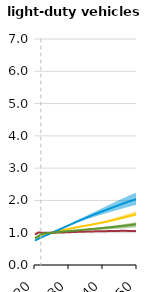
| Category | Reference |
|---|---|
| 2020.0 | 0.83 |
| 2021.0 | 0.895 |
| 2022.0 | 0.963 |
| 2023.0 | 0.982 |
| 2024.0 | 0.992 |
| 2025.0 | 1 |
| 2026.0 | 1.01 |
| 2027.0 | 1.022 |
| 2028.0 | 1.034 |
| 2029.0 | 1.044 |
| 2030.0 | 1.053 |
| 2031.0 | 1.061 |
| 2032.0 | 1.069 |
| 2033.0 | 1.078 |
| 2034.0 | 1.088 |
| 2035.0 | 1.098 |
| 2036.0 | 1.107 |
| 2037.0 | 1.116 |
| 2038.0 | 1.126 |
| 2039.0 | 1.136 |
| 2040.0 | 1.146 |
| 2041.0 | 1.157 |
| 2042.0 | 1.168 |
| 2043.0 | 1.179 |
| 2044.0 | 1.189 |
| 2045.0 | 1.201 |
| 2046.0 | 1.213 |
| 2047.0 | 1.226 |
| 2048.0 | 1.239 |
| 2049.0 | 1.252 |
| 2050.0 | 1.265 |